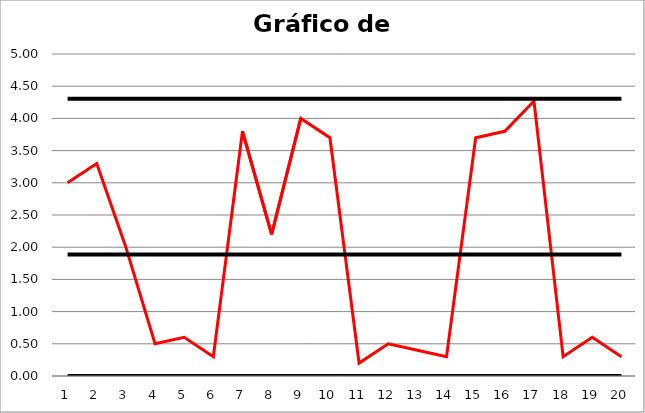
| Category | Rango | LSC | LCC | LIC |
|---|---|---|---|---|
| 0 | 3 | 4.306 | 1.888 | 0 |
| 1 | 3.3 | 4.306 | 1.888 | 0 |
| 2 | 2 | 4.306 | 1.888 | 0 |
| 3 | 0.5 | 4.306 | 1.888 | 0 |
| 4 | 0.6 | 4.306 | 1.888 | 0 |
| 5 | 0.3 | 4.306 | 1.888 | 0 |
| 6 | 3.8 | 4.306 | 1.888 | 0 |
| 7 | 2.2 | 4.306 | 1.888 | 0 |
| 8 | 4 | 4.306 | 1.888 | 0 |
| 9 | 3.7 | 4.306 | 1.888 | 0 |
| 10 | 0.2 | 4.306 | 1.888 | 0 |
| 11 | 0.5 | 4.306 | 1.888 | 0 |
| 12 | 0.4 | 4.306 | 1.888 | 0 |
| 13 | 0.3 | 4.306 | 1.888 | 0 |
| 14 | 3.7 | 4.306 | 1.888 | 0 |
| 15 | 3.8 | 4.306 | 1.888 | 0 |
| 16 | 4.27 | 4.306 | 1.888 | 0 |
| 17 | 0.3 | 4.306 | 1.888 | 0 |
| 18 | 0.6 | 4.306 | 1.888 | 0 |
| 19 | 0.3 | 4.306 | 1.888 | 0 |